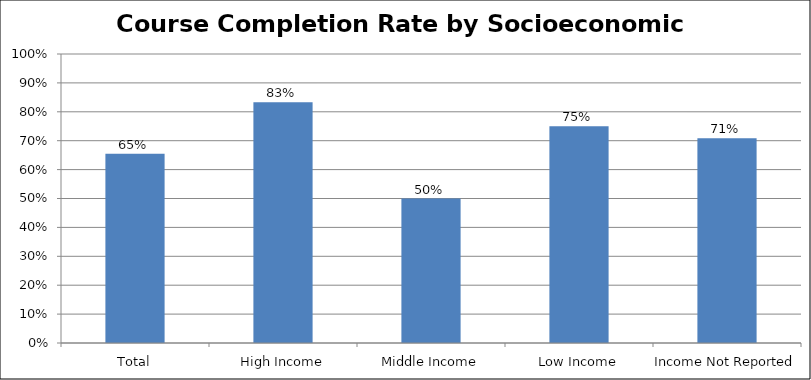
| Category | Completion Rate by SES |
|---|---|
| Total | 0.655 |
| High Income | 0.833 |
| Middle Income | 0.5 |
| Low Income | 0.75 |
| Income Not Reported | 0.708 |